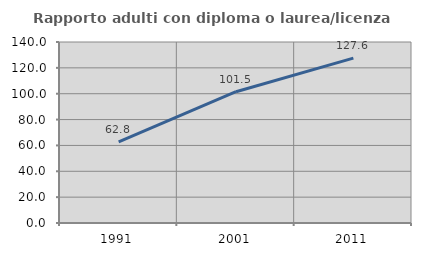
| Category | Rapporto adulti con diploma o laurea/licenza media  |
|---|---|
| 1991.0 | 62.8 |
| 2001.0 | 101.549 |
| 2011.0 | 127.556 |